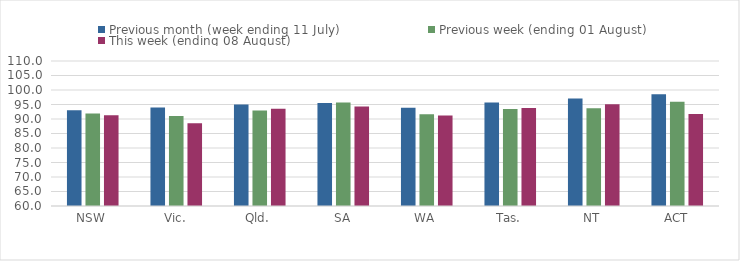
| Category | Previous month (week ending 11 July) | Previous week (ending 01 August) | This week (ending 08 August) |
|---|---|---|---|
| NSW | 93.004 | 91.908 | 91.335 |
| Vic. | 93.979 | 91.059 | 88.518 |
| Qld. | 94.972 | 92.914 | 93.564 |
| SA | 95.48 | 95.713 | 94.297 |
| WA | 93.881 | 91.608 | 91.205 |
| Tas. | 95.66 | 93.423 | 93.75 |
| NT | 97.082 | 93.696 | 95.091 |
| ACT | 98.553 | 95.986 | 91.736 |